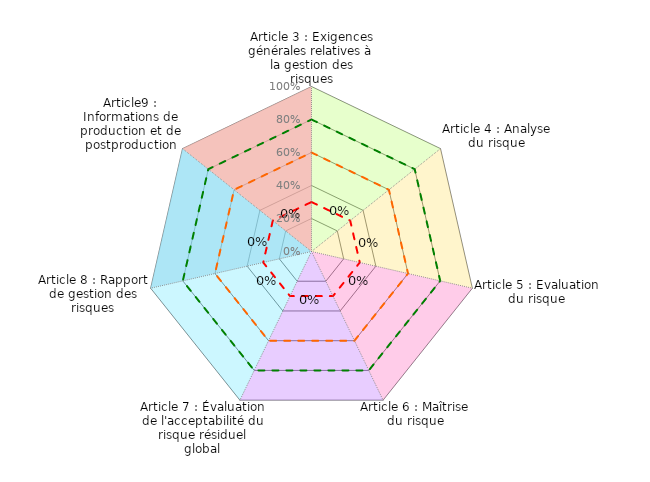
| Category | Coloriage Art4 | Coloriage Art5 | Coloriage Art6 | Coloriage Art7 | Coloriage Art8 | Coloriage Art9 | Coloriage Art10 | Conforme | Convaincant | Informel | Résultat |
|---|---|---|---|---|---|---|---|---|---|---|---|
| Article 3 : Exigences générales relatives à la gestion des risques | 1 | 0 | 0 | 0 | 0 | 0 | 1 | 0.8 | 0.6 | 0.3 | 0 |
| Article 4 : Analyse du risque | 1 | 1 | 0 | 0 | 0 | 0 | 0 | 0.8 | 0.6 | 0.3 | 0 |
| Article 5 : Evaluation du risque | 0 | 1 | 1 | 0 | 0 | 0 | 0 | 0.8 | 0.6 | 0.3 | 0 |
| Article 6 : Maîtrise du risque | 0 | 0 | 1 | 1 | 0 | 0 | 0 | 0.8 | 0.6 | 0.3 | 0 |
| Article 7 : Évaluation de l'acceptabilité du risque résiduel global | 0 | 0 | 0 | 1 | 1 | 0 | 1 | 0.8 | 0.6 | 0.3 | 0 |
| Article 8 : Rapport de gestion des risques | 0 | 0 | 0 | 0 | 1 | 1 | 0 | 0.8 | 0.6 | 0.3 | 0 |
| Article9 : Informations de production et de postproduction | 0 | 0 | 0 | 0 | 0 | 1 | 1 | 0.8 | 0.6 | 0.3 | 0 |